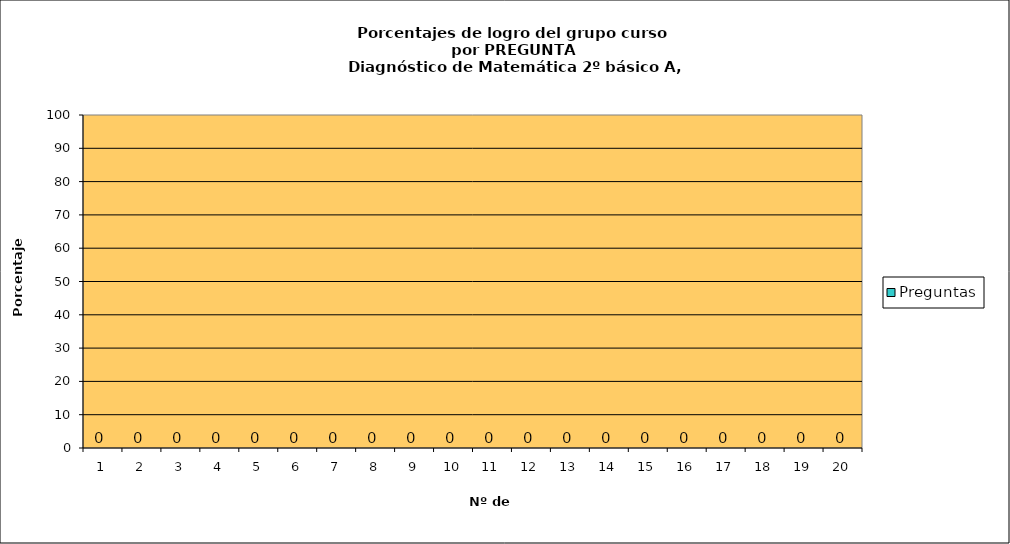
| Category | Preguntas |
|---|---|
| 0 | 0 |
| 1 | 0 |
| 2 | 0 |
| 3 | 0 |
| 4 | 0 |
| 5 | 0 |
| 6 | 0 |
| 7 | 0 |
| 8 | 0 |
| 9 | 0 |
| 10 | 0 |
| 11 | 0 |
| 12 | 0 |
| 13 | 0 |
| 14 | 0 |
| 15 | 0 |
| 16 | 0 |
| 17 | 0 |
| 18 | 0 |
| 19 | 0 |